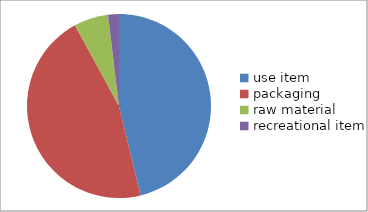
| Category | Series 0 |
|---|---|
| use item | 0.462 |
| packaging | 0.458 |
| raw material | 0.06 |
| recreational item | 0.019 |